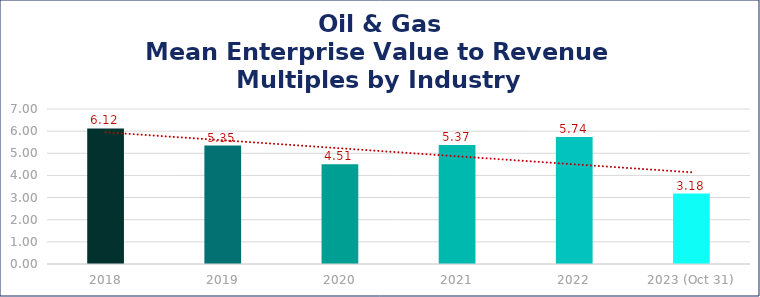
| Category | Oil & Gas |
|---|---|
| 2018 | 6.12 |
| 2019 | 5.35 |
| 2020 | 4.51 |
| 2021 | 5.37 |
| 2022 | 5.74 |
| 2023 (Oct 31) | 3.18 |